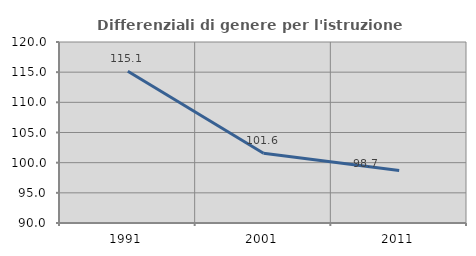
| Category | Differenziali di genere per l'istruzione superiore |
|---|---|
| 1991.0 | 115.149 |
| 2001.0 | 101.55 |
| 2011.0 | 98.706 |